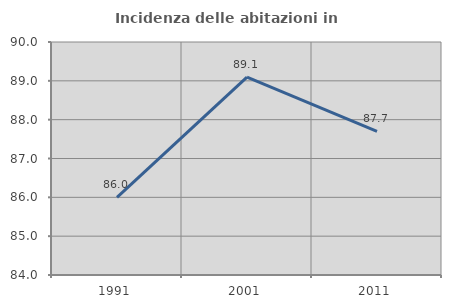
| Category | Incidenza delle abitazioni in proprietà  |
|---|---|
| 1991.0 | 86 |
| 2001.0 | 89.096 |
| 2011.0 | 87.696 |